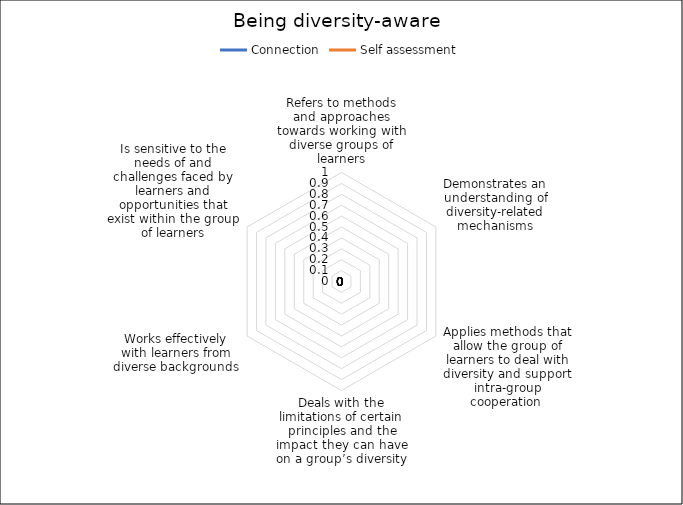
| Category | Connection | Self assessment |
|---|---|---|
| Refers to methods and approaches towards working with diverse groups of learners | 0 | 0 |
| Demonstrates an understanding of diversity-related mechanisms | 0 | 0 |
| Applies methods that allow the group of learners to deal with diversity and support intra-group cooperation  | 0 | 0 |
| Deals with the limitations of certain principles and the impact they can have on a group’s diversity | 0 | 0 |
| Works effectively with learners from diverse backgrounds | 0 | 0 |
| Is sensitive to the needs of and challenges faced by learners and opportunities that exist within the group of learners | 0 | 0 |